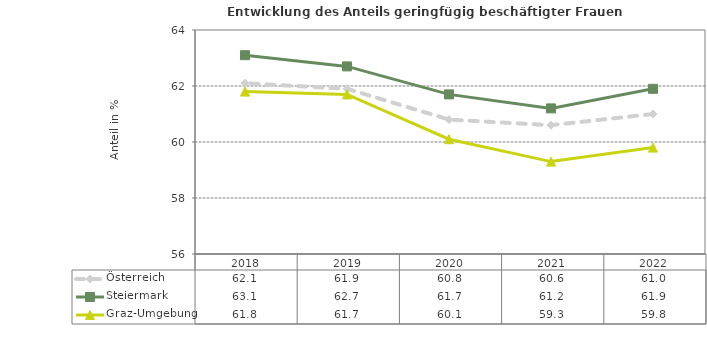
| Category | Österreich | Steiermark | Graz-Umgebung |
|---|---|---|---|
| 2022.0 | 61 | 61.9 | 59.8 |
| 2021.0 | 60.6 | 61.2 | 59.3 |
| 2020.0 | 60.8 | 61.7 | 60.1 |
| 2019.0 | 61.9 | 62.7 | 61.7 |
| 2018.0 | 62.1 | 63.1 | 61.8 |